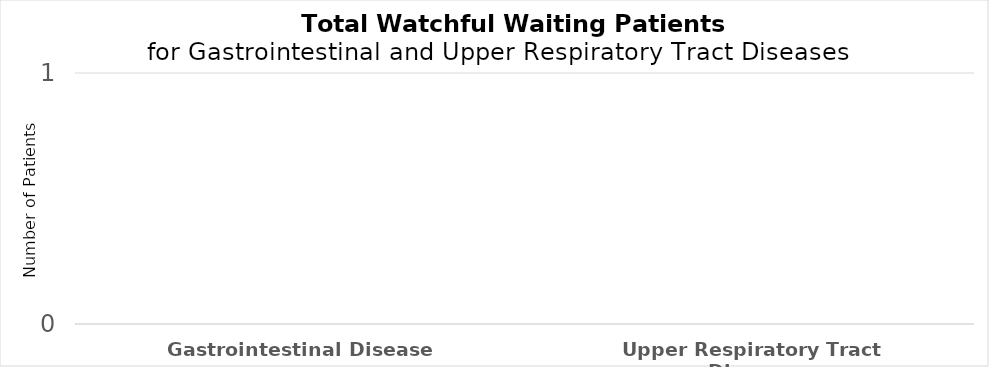
| Category | Number of Patients |
|---|---|
| Gastrointestinal Disease | 0 |
| Upper Respiratory Tract Disease | 0 |